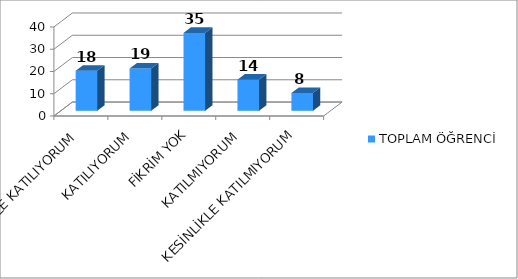
| Category | TOPLAM ÖĞRENCİ |
|---|---|
| KESİNLİKLE KATILIYORUM | 18 |
| KATILIYORUM | 19 |
| FİKRİM YOK | 35 |
| KATILMIYORUM | 14 |
| KESİNLİKLE KATILMIYORUM | 8 |